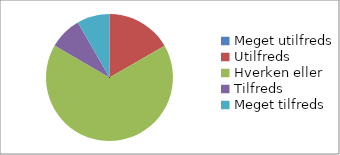
| Category | Hvor tilfreds er du med workshoppen 'Rekruttering til ingeniøruddannelserne'? (n=12) |
|---|---|
| Meget utilfreds | 0 |
| Utilfreds | 0.167 |
| Hverken eller | 0.667 |
| Tilfreds | 0.083 |
| Meget tilfreds | 0.083 |